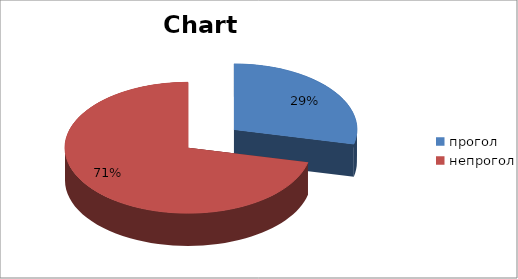
| Category | Series 0 |
|---|---|
| прогол | 36 |
| непрогол | 90 |